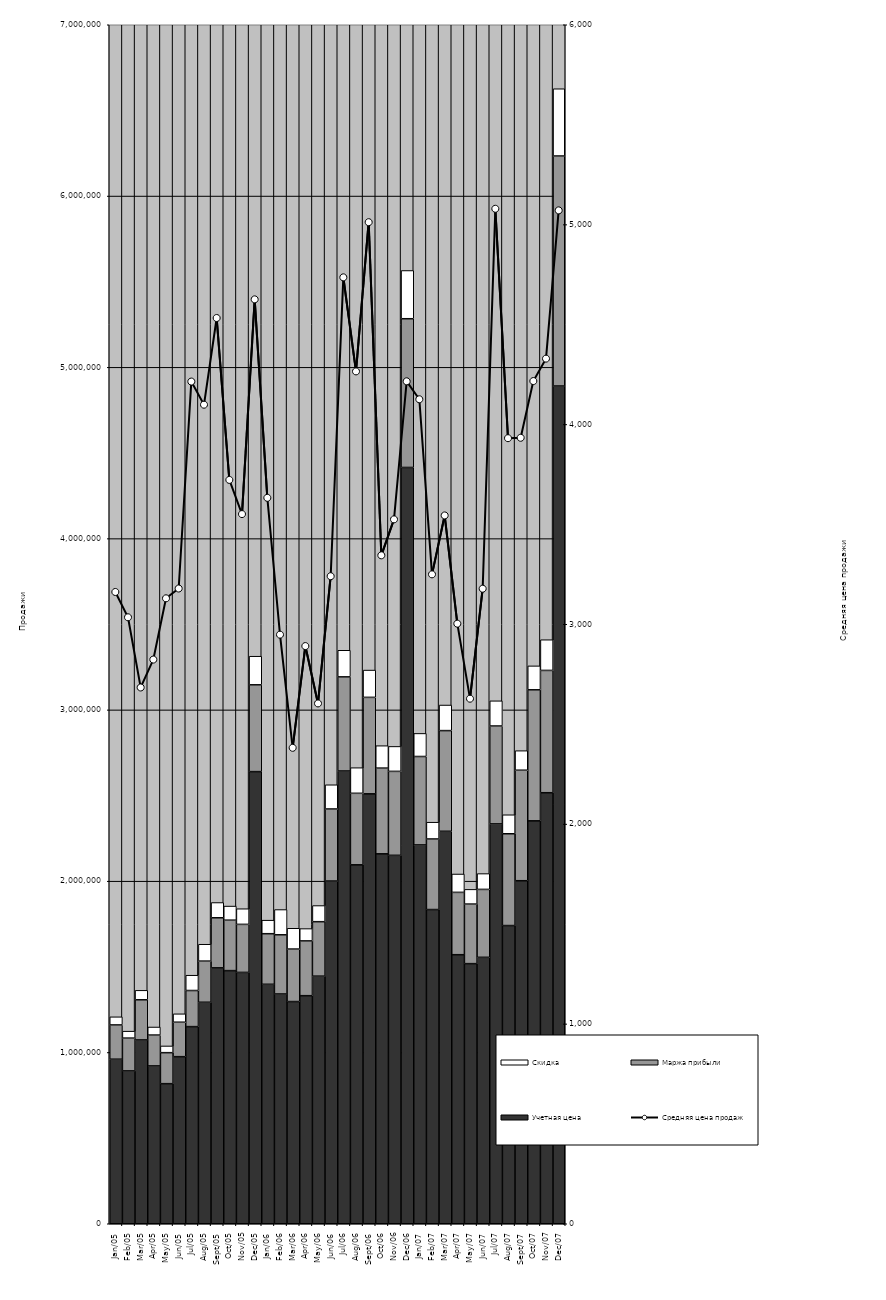
| Category | Учетная цена | Маржа прибыли | Скидка |
|---|---|---|---|
| 2005-01-01 | 960693.49 | 200022.51 | 47379 |
| 2005-02-01 | 892359.71 | 191532.29 | 40471 |
| 2005-03-01 | 1073272.33 | 234243.67 | 55301 |
| 2005-04-01 | 921496.02 | 180108.98 | 46982 |
| 2005-05-01 | 817806.9 | 181001.1 | 39210 |
| 2005-06-01 | 975480.01 | 201168.99 | 48949 |
| 2005-07-01 | 1150867.28 | 210801.72 | 89354 |
| 2005-08-01 | 1293077.39 | 240292.61 | 98453 |
| 2005-09-01 | 1493957.02 | 292330.98 | 89106 |
| 2005-10-01 | 1477799.49 | 294633.51 | 82260 |
| 2005-11-01 | 1467437.32 | 280420.68 | 91276 |
| 2005-12-01 | 2639601.07 | 506737.93 | 167060 |
| 2006-01-01 | 1398055.05 | 295352.95 | 79030 |
| 2006-02-01 | 1341508.64 | 345377.36 | 147484 |
| 2006-03-01 | 1297212.24 | 306538.76 | 121431 |
| 2006-04-01 | 1331507.43 | 319819.57 | 71926 |
| 2006-05-01 | 1445552.72 | 318024.28 | 94091 |
| 2006-06-01 | 2000785.97 | 420769.03 | 141286 |
| 2006-07-01 | 2643299.6 | 549533.4 | 155318 |
| 2006-08-01 | 2095480.46 | 417517.54 | 149600 |
| 2006-09-01 | 2509919.79 | 563184.21 | 159425 |
| 2006-10-01 | 2159745.57 | 500435.43 | 130921 |
| 2006-11-01 | 2150958.3 | 490113.7 | 145755 |
| 2006-12-01 | 4415401.23 | 868268.77 | 281612 |
| 2007-01-01 | 2211638.61 | 516310.39 | 134760 |
| 2007-02-01 | 1834423.25 | 412000.75 | 97955 |
| 2007-03-01 | 2291271.79 | 587810.21 | 149361 |
| 2007-04-01 | 1570772.73 | 363926.27 | 107137 |
| 2007-05-01 | 1518652.09 | 347720.91 | 85839 |
| 2007-06-01 | 1555437.42 | 396552.58 | 92380 |
| 2007-07-01 | 2334375.29 | 571601.71 | 146962 |
| 2007-08-01 | 1740933.67 | 535921.33 | 110873 |
| 2007-09-01 | 2002760.32 | 645120.68 | 114120 |
| 2007-10-01 | 2352284.22 | 764969.78 | 139681 |
| 2007-11-01 | 2516492.58 | 714016.42 | 179189 |
| 2007-12-01 | 4890916.12 | 1342834.88 | 392640 |